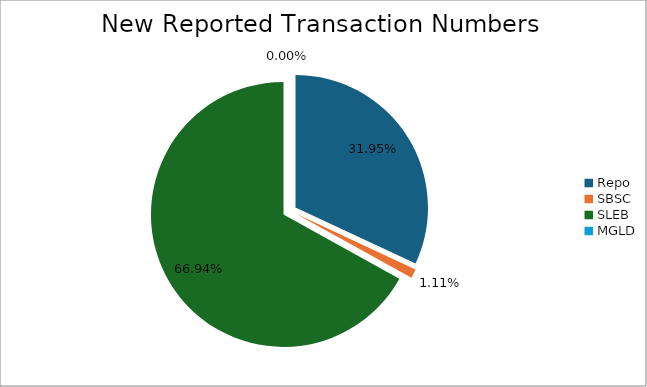
| Category | Series 0 |
|---|---|
| Repo | 303894 |
| SBSC | 10543 |
| SLEB | 636651 |
| MGLD | 17 |